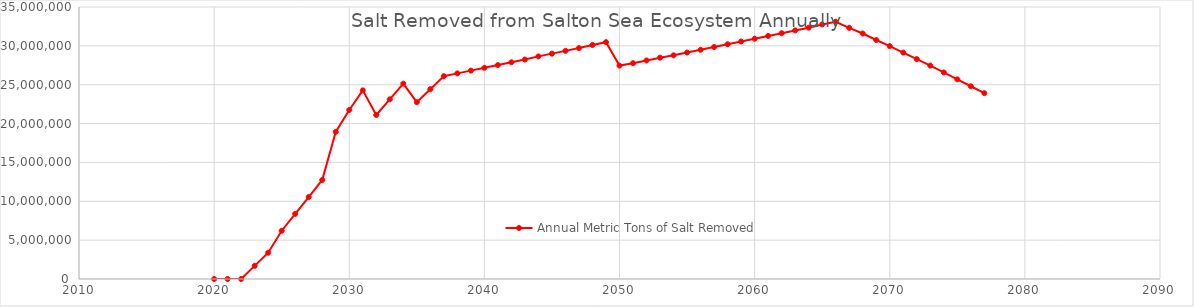
| Category | Annual Metric Tons of Salt Removed |
|---|---|
| 2020.0 | 0 |
| 2021.0 | 0 |
| 2022.0 | 0 |
| 2023.0 | 1689987.366 |
| 2024.0 | 3379974.732 |
| 2025.0 | 6208902.636 |
| 2026.0 | 8379133.326 |
| 2027.0 | 10549364.016 |
| 2028.0 | 12745277.593 |
| 2029.0 | 18933408.427 |
| 2030.0 | 21751004.529 |
| 2031.0 | 24273056.354 |
| 2032.0 | 21103350.6 |
| 2033.0 | 23119450.302 |
| 2034.0 | 25135550.004 |
| 2035.0 | 22754037.291 |
| 2036.0 | 24427946.942 |
| 2037.0 | 26101856.594 |
| 2038.0 | 26457864.285 |
| 2039.0 | 26813871.976 |
| 2040.0 | 27169879.667 |
| 2041.0 | 27525887.358 |
| 2042.0 | 27881895.049 |
| 2043.0 | 28237902.74 |
| 2044.0 | 28644768.672 |
| 2045.0 | 29000776.363 |
| 2046.0 | 29356784.054 |
| 2047.0 | 29712791.745 |
| 2048.0 | 30119657.678 |
| 2049.0 | 30475665.369 |
| 2050.0 | 27460630.796 |
| 2051.0 | 27765780.245 |
| 2052.0 | 28121787.936 |
| 2053.0 | 28477795.627 |
| 2054.0 | 28782945.077 |
| 2055.0 | 29138952.767 |
| 2056.0 | 29494960.458 |
| 2057.0 | 29850968.149 |
| 2058.0 | 30206975.84 |
| 2059.0 | 30562983.531 |
| 2060.0 | 30918991.222 |
| 2061.0 | 31274998.913 |
| 2062.0 | 31631006.604 |
| 2063.0 | 31987014.295 |
| 2064.0 | 32343021.986 |
| 2065.0 | 32749887.919 |
| 2066.0 | 33105895.61 |
| 2067.0 | 32321269.799 |
| 2068.0 | 31587502.23 |
| 2069.0 | 30752018.177 |
| 2070.0 | 29967392.367 |
| 2071.0 | 29131908.314 |
| 2072.0 | 28296424.262 |
| 2073.0 | 27460940.209 |
| 2074.0 | 26574597.915 |
| 2075.0 | 25688255.621 |
| 2076.0 | 24801913.327 |
| 2077.0 | 23915571.033 |